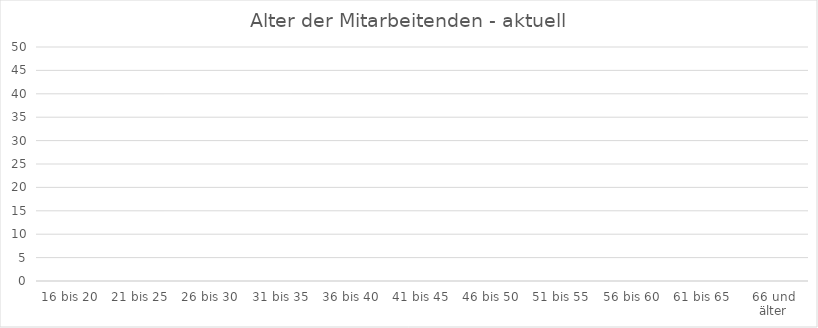
| Category | Series 0 |
|---|---|
| 16 bis 20 | 0 |
| 21 bis 25 | 0 |
| 26 bis 30 | 0 |
| 31 bis 35 | 0 |
| 36 bis 40 | 0 |
| 41 bis 45 | 0 |
| 46 bis 50 | 0 |
| 51 bis 55 | 0 |
| 56 bis 60 | 0 |
| 61 bis 65 | 0 |
| 66 und älter | 0 |